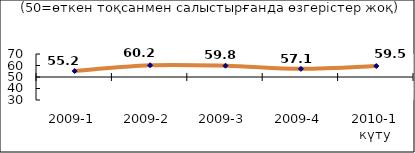
| Category | Диф.индекс ↓ |
|---|---|
| 2009-1 | 55.175 |
| 2009-2 | 60.22 |
| 2009-3 | 59.79 |
| 2009-4 | 57.085 |
| 2010-1 күту | 59.54 |